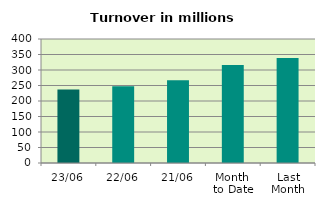
| Category | Series 0 |
|---|---|
| 23/06 | 237.398 |
| 22/06 | 247.332 |
| 21/06 | 266.906 |
| Month 
to Date | 315.784 |
| Last
Month | 338.969 |